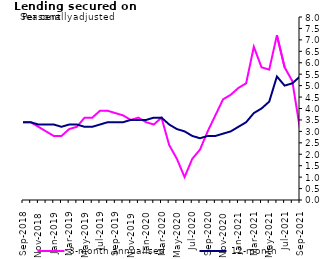
| Category | 3-month annualised | 12-month |
|---|---|---|
| Sep-2018 | 3.4 | 3.4 |
| Oct-2018 | 3.4 | 3.4 |
| Nov-2018 | 3.2 | 3.3 |
| Dec-2018 | 3 | 3.3 |
| Jan-2019 | 2.8 | 3.3 |
| Feb-2019 | 2.8 | 3.2 |
| Mar-2019 | 3.1 | 3.3 |
| Apr-2019 | 3.2 | 3.3 |
| May-2019 | 3.6 | 3.2 |
| Jun-2019 | 3.6 | 3.2 |
| Jul-2019 | 3.9 | 3.3 |
| Aug-2019 | 3.9 | 3.4 |
| Sep-2019 | 3.8 | 3.4 |
| Oct-2019 | 3.7 | 3.4 |
| Nov-2019 | 3.5 | 3.5 |
| Dec-2019 | 3.6 | 3.5 |
| Jan-2020 | 3.4 | 3.5 |
| Feb-2020 | 3.3 | 3.6 |
| Mar-2020 | 3.6 | 3.6 |
| Apr-2020 | 2.4 | 3.3 |
| May-2020 | 1.8 | 3.1 |
| Jun-2020 | 1 | 3 |
| Jul-2020 | 1.8 | 2.8 |
| Aug-2020 | 2.2 | 2.7 |
| Sep-2020 | 3 | 2.8 |
| Oct-2020 | 3.7 | 2.8 |
| Nov-2020 | 4.4 | 2.9 |
| Dec-2020 | 4.6 | 3 |
| Jan-2021 | 4.9 | 3.2 |
| Feb-2021 | 5.1 | 3.4 |
| Mar-2021 | 6.7 | 3.8 |
| Apr-2021 | 5.8 | 4 |
| May-2021 | 5.7 | 4.3 |
| Jun-2021 | 7.2 | 5.4 |
| Jul-2021 | 5.8 | 5 |
| Aug-2021 | 5.2 | 5.1 |
| Sep-2021 | 3.1 | 5.4 |